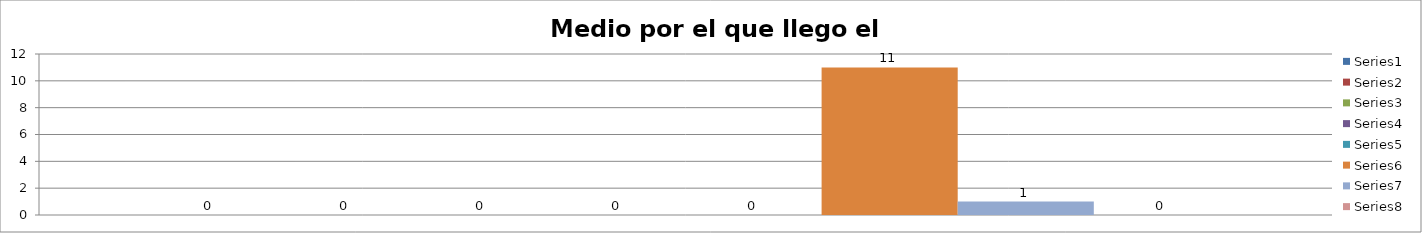
| Category | Series 0 | Series 1 | Series 2 | Series 3 | Series 4 | Series 5 | Series 6 | Series 7 |
|---|---|---|---|---|---|---|---|---|
| 0 | 0 | 0 | 0 | 0 | 0 | 11 | 1 | 0 |